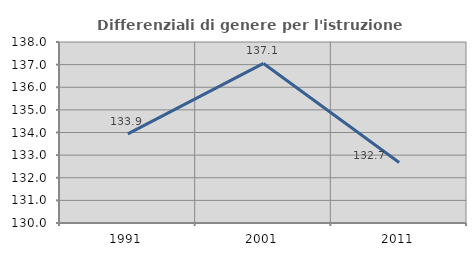
| Category | Differenziali di genere per l'istruzione superiore |
|---|---|
| 1991.0 | 133.939 |
| 2001.0 | 137.052 |
| 2011.0 | 132.677 |